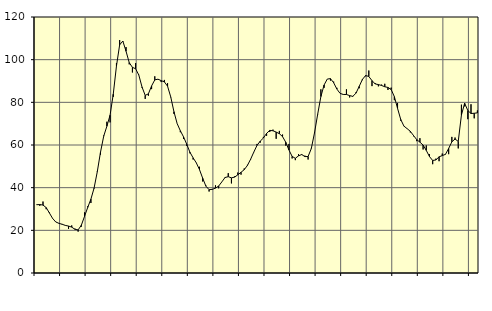
| Category | Piggar | Series 1 |
|---|---|---|
| nan | 31.9 | 32 |
| 87.0 | 31.5 | 32.09 |
| 87.0 | 33.5 | 31.84 |
| 87.0 | 29.9 | 30.66 |
| nan | 28.4 | 28.16 |
| 88.0 | 25.5 | 25.61 |
| 88.0 | 24 | 23.91 |
| 88.0 | 23.2 | 23.28 |
| nan | 23 | 22.83 |
| 89.0 | 22.2 | 22.31 |
| 89.0 | 20.7 | 22 |
| 89.0 | 22.3 | 21.5 |
| nan | 20.8 | 20.48 |
| 90.0 | 19.4 | 20.21 |
| 90.0 | 21.7 | 22.38 |
| 90.0 | 28.4 | 26.5 |
| nan | 31.3 | 30.73 |
| 91.0 | 32.8 | 34.6 |
| 91.0 | 39.6 | 39.81 |
| 91.0 | 47.7 | 47.47 |
| nan | 55.5 | 56.57 |
| 92.0 | 64.4 | 64.08 |
| 92.0 | 70.9 | 68.8 |
| 92.0 | 70.6 | 73.96 |
| nan | 82.6 | 83.82 |
| 93.0 | 98.4 | 97.02 |
| 93.0 | 109.2 | 106.95 |
| 93.0 | 108.5 | 108.73 |
| nan | 105.9 | 103.95 |
| 94.0 | 97.8 | 98.62 |
| 94.0 | 94 | 96.4 |
| 94.0 | 98.4 | 95.74 |
| nan | 92.9 | 92.78 |
| 95.0 | 86.9 | 87.21 |
| 95.0 | 81.6 | 83.26 |
| 95.0 | 83.1 | 83.99 |
| nan | 86.2 | 87.69 |
| 96.0 | 92.2 | 90.52 |
| 96.0 | 90.9 | 90.85 |
| 96.0 | 89.5 | 90.18 |
| nan | 90.5 | 89.58 |
| 97.0 | 89 | 87.57 |
| 97.0 | 82.4 | 82.52 |
| 97.0 | 74.6 | 75.61 |
| nan | 70 | 70.04 |
| 98.0 | 66 | 66.68 |
| 98.0 | 62.8 | 63.81 |
| 98.0 | 59.6 | 60.38 |
| nan | 56.1 | 56.63 |
| 99.0 | 53.2 | 53.98 |
| 99.0 | 51.7 | 51.64 |
| 99.0 | 49.8 | 48.45 |
| nan | 42.9 | 44.41 |
| 0.0 | 41 | 40.71 |
| 0.0 | 38.2 | 39.05 |
| 0.0 | 39.4 | 39.2 |
| nan | 41.1 | 39.79 |
| 1.0 | 39.7 | 40.76 |
| 1.0 | 42.7 | 42.72 |
| 1.0 | 45 | 44.76 |
| nan | 46.8 | 45.15 |
| 2.0 | 42 | 44.59 |
| 2.0 | 45.3 | 44.95 |
| 2.0 | 47.1 | 46.03 |
| nan | 46.1 | 47.2 |
| 3.0 | 49 | 48.44 |
| 3.0 | 50.7 | 50.41 |
| 3.0 | 53.1 | 53.33 |
| nan | 56.6 | 56.67 |
| 4.0 | 60.5 | 59.82 |
| 4.0 | 61.1 | 61.79 |
| 4.0 | 63.8 | 63.26 |
| nan | 64.3 | 65.44 |
| 5.0 | 66.1 | 66.86 |
| 5.0 | 67.2 | 66.67 |
| 5.0 | 62.9 | 66.06 |
| nan | 66.6 | 65.3 |
| 6.0 | 64.9 | 63.93 |
| 6.0 | 59.7 | 61.31 |
| 6.0 | 60.5 | 57.65 |
| nan | 53.7 | 54.65 |
| 7.0 | 52.9 | 53.77 |
| 7.0 | 55.7 | 54.91 |
| 7.0 | 55.3 | 55.53 |
| nan | 55 | 54.56 |
| 8.0 | 53.2 | 54.61 |
| 8.0 | 58.5 | 58.33 |
| 8.0 | 65.9 | 65.66 |
| nan | 74.3 | 74.46 |
| 9.0 | 86.1 | 82.71 |
| 9.0 | 86.8 | 88.13 |
| 9.0 | 90.9 | 90.91 |
| nan | 90.2 | 91.11 |
| 10.0 | 89.7 | 89.18 |
| 10.0 | 86.8 | 86.23 |
| 10.0 | 84.2 | 84.2 |
| nan | 83.6 | 83.7 |
| 11.0 | 86.1 | 83.67 |
| 11.0 | 82.3 | 83.16 |
| 11.0 | 82.6 | 82.8 |
| nan | 84.7 | 84.33 |
| 12.0 | 86.6 | 87.48 |
| 12.0 | 90.4 | 90.74 |
| 12.0 | 92.2 | 92.57 |
| nan | 94.9 | 92.12 |
| 13.0 | 87.6 | 90.18 |
| 13.0 | 89 | 88.63 |
| 13.0 | 87.5 | 88.33 |
| nan | 88.3 | 87.91 |
| 14.0 | 88.7 | 87.3 |
| 14.0 | 85.8 | 86.98 |
| 14.0 | 86.9 | 86 |
| nan | 81 | 82.67 |
| 15.0 | 79.7 | 77.19 |
| 15.0 | 71.4 | 71.95 |
| 15.0 | 68.8 | 68.86 |
| nan | 67.6 | 67.66 |
| 16.0 | 65.9 | 66.41 |
| 16.0 | 64.1 | 64.44 |
| 16.0 | 61.8 | 62.53 |
| nan | 63.2 | 61.32 |
| 17.0 | 57.9 | 59.99 |
| 17.0 | 59.8 | 57.45 |
| 17.0 | 55.7 | 54.56 |
| nan | 51 | 52.75 |
| 18.0 | 53.6 | 52.99 |
| 18.0 | 52.4 | 54.47 |
| 18.0 | 56 | 55.03 |
| nan | 55.5 | 55.62 |
| 19.0 | 55.7 | 58.36 |
| 19.0 | 63.8 | 61.49 |
| 19.0 | 63.5 | 62.79 |
| nan | 58.4 | 61.69 |
| 20.0 | 78.9 | 74.06 |
| 20.0 | 78.1 | 79.57 |
| 20.0 | 72.1 | 76.17 |
| nan | 79.1 | 74.76 |
| 21.0 | 72.5 | 74.88 |
| 21.0 | 76.2 | 75.08 |